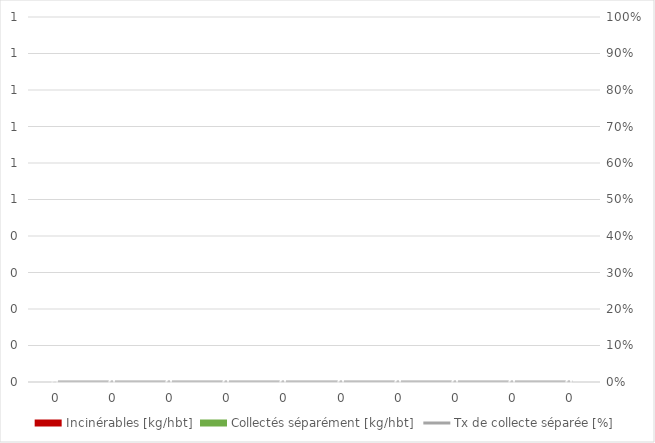
| Category | Incinérables [kg/hbt] | Collectés séparément [kg/hbt] |
|---|---|---|
| 0.0 | 0 | 0 |
| 0.0 | 0 | 0 |
| 0.0 | 0 | 0 |
| 0.0 | 0 | 0 |
| 0.0 | 0 | 0 |
| 0.0 | 0 | 0 |
| 0.0 | 0 | 0 |
| 0.0 | 0 | 0 |
| 0.0 | 0 | 0 |
| 0.0 | 0 | 0 |